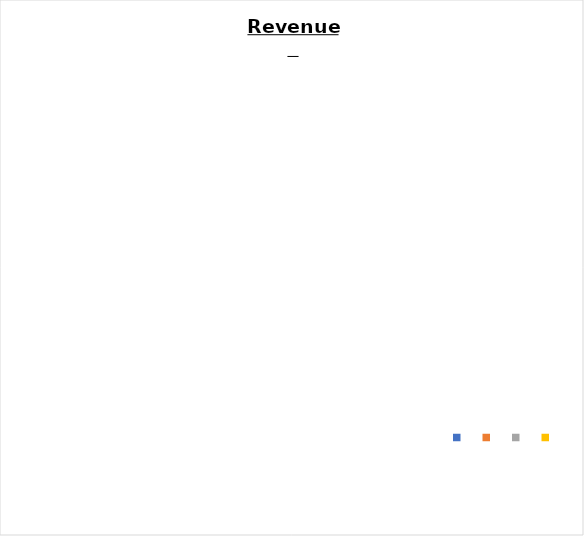
| Category | Series 1 | Series 0 |
|---|---|---|
|  | 0 |  |
|  | 0 |  |
|  | 0 |  |
|  | 0 |  |